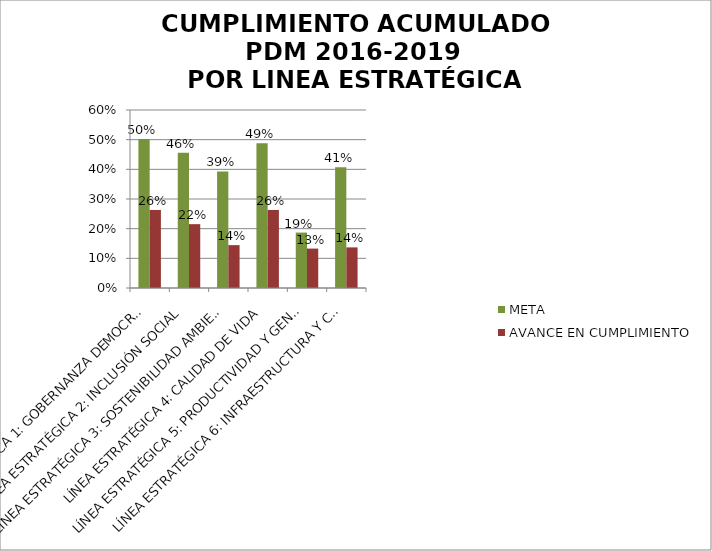
| Category | META | AVANCE EN CUMPLIMIENTO |
|---|---|---|
| LÍNEA ESTRATÉGICA 1: GOBERNANZA DEMOCRÁTICA | 0.502 | 0.263 |
| LÍNEA ESTRATÉGICA 2: INCLUSIÓN SOCIAL | 0.456 | 0.215 |
| LÍNEA ESTRATÉGICA 3: SOSTENIBILIDAD AMBIENTAL | 0.393 | 0.144 |
| LÍNEA ESTRATÉGICA 4: CALIDAD DE VIDA | 0.488 | 0.263 |
| LÍNEA ESTRATÉGICA 5: PRODUCTIVIDAD Y GENERACIÓN DE OPORTUNIDADES | 0.187 | 0.133 |
| LÍNEA ESTRATÉGICA 6: INFRAESTRUCTURA Y CONECTIVIDAD | 0.407 | 0.137 |